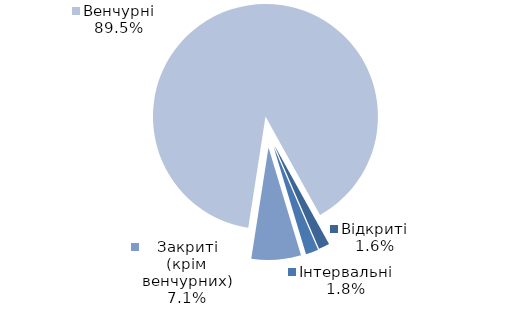
| Category | Series 0 |
|---|---|
| Відкриті | 19 |
| Інтервальні | 22 |
| Закриті (крім венчурних) | 86 |
| Венчурні | 1082 |